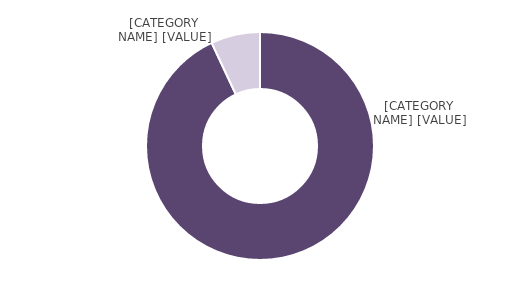
| Category | Series 0 |
|---|---|
| Men | 0.93 |
| Women | 0.07 |